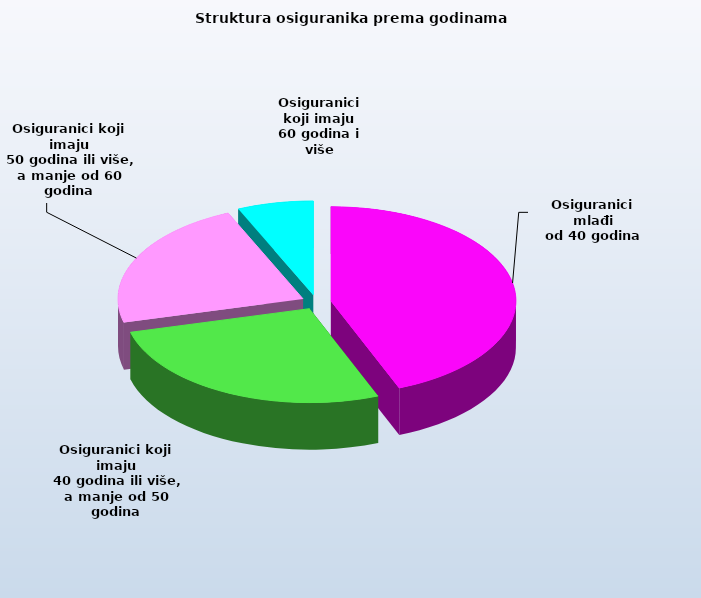
| Category | Series 0 |
|---|---|
| Osiguranici mlađi
od 40 godina | 683429 |
| Osiguranici koji imaju
 40 godina ili više, a manje od 50 godina | 419389 |
| Osiguranici koji imaju
 50 godina ili više, a manje od 60 godina | 348358 |
| Osiguranici koji imaju
60 godina i više | 103154 |